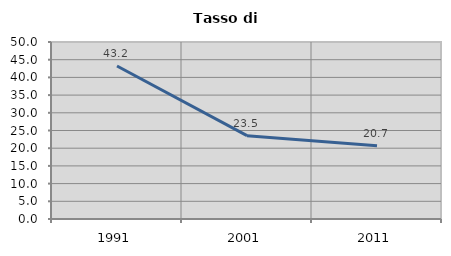
| Category | Tasso di disoccupazione   |
|---|---|
| 1991.0 | 43.21 |
| 2001.0 | 23.55 |
| 2011.0 | 20.725 |